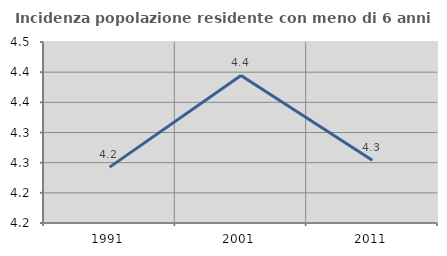
| Category | Incidenza popolazione residente con meno di 6 anni |
|---|---|
| 1991.0 | 4.243 |
| 2001.0 | 4.395 |
| 2011.0 | 4.254 |